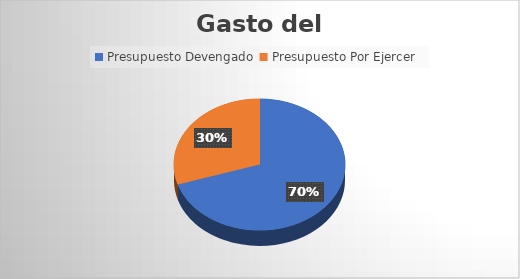
| Category | Monto  |
|---|---|
| Presupuesto Devengado  | 25648319.5 |
| Presupuesto Por Ejercer  | 10939994.07 |